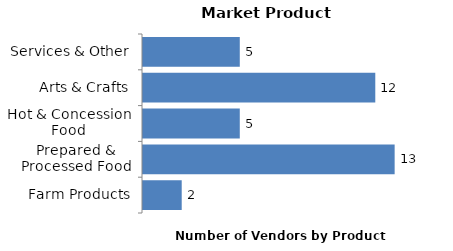
| Category | Series 0 |
|---|---|
| Farm Products | 2 |
| Prepared & Processed Food | 13 |
| Hot & Concession Food | 5 |
| Arts & Crafts | 12 |
| Services & Other | 5 |